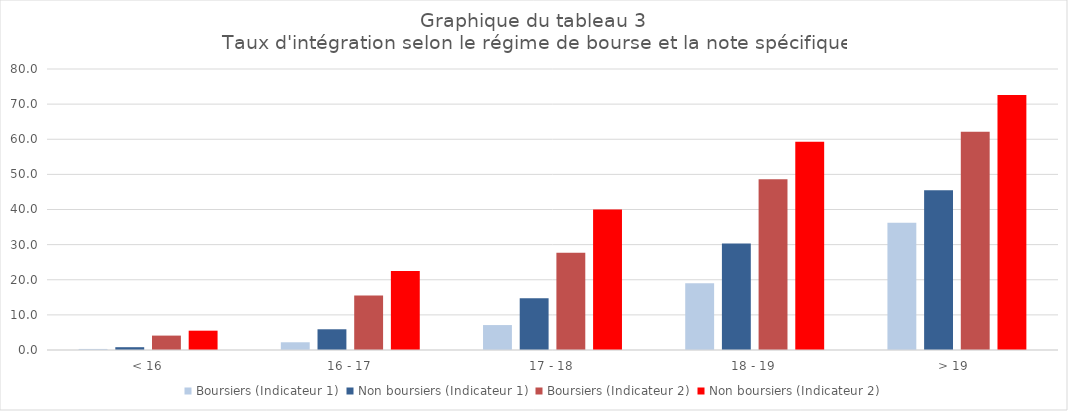
| Category | Boursiers (Indicateur 1) | Non boursiers (Indicateur 1) | Boursiers (Indicateur 2) | Non boursiers (Indicateur 2) |
|---|---|---|---|---|
| < 16 | 0.3 | 0.8 | 4.1 | 5.5 |
| 16 - 17 | 2.2 | 5.9 | 15.5 | 22.5 |
| 17 - 18 | 7.1 | 14.7 | 27.7 | 40 |
| 18 - 19 | 19 | 30.3 | 48.6 | 59.3 |
| > 19  | 36.2 | 45.5 | 62.1 | 72.6 |